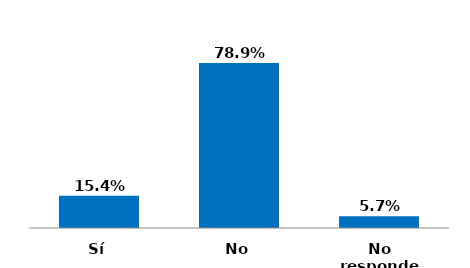
| Category | Series 0 |
|---|---|
| Sí | 0.154 |
| No | 0.789 |
| No responde | 0.057 |